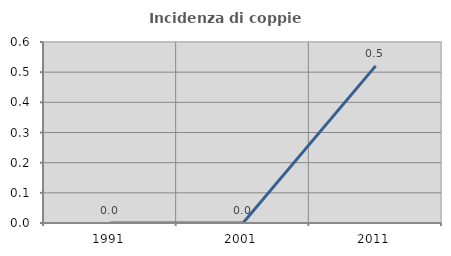
| Category | Incidenza di coppie miste |
|---|---|
| 1991.0 | 0 |
| 2001.0 | 0 |
| 2011.0 | 0.521 |